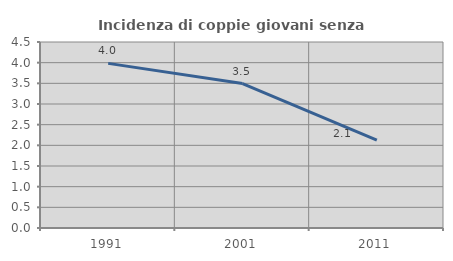
| Category | Incidenza di coppie giovani senza figli |
|---|---|
| 1991.0 | 3.983 |
| 2001.0 | 3.496 |
| 2011.0 | 2.125 |